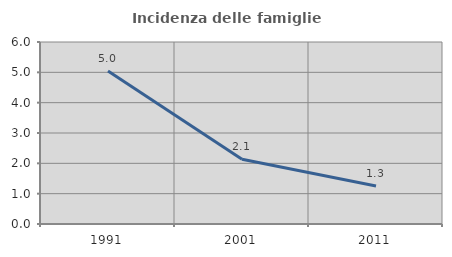
| Category | Incidenza delle famiglie numerose |
|---|---|
| 1991.0 | 5.046 |
| 2001.0 | 2.137 |
| 2011.0 | 1.25 |